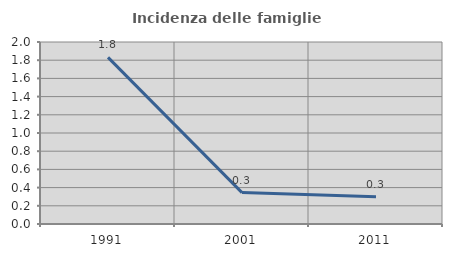
| Category | Incidenza delle famiglie numerose |
|---|---|
| 1991.0 | 1.832 |
| 2001.0 | 0.345 |
| 2011.0 | 0.299 |